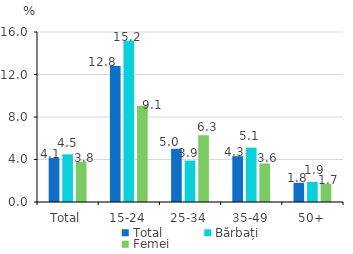
| Category | Total | Bărbați | Femei |
|---|---|---|---|
| Total | 4.138 | 4.486 | 3.781 |
| 15-24 | 12.789 | 15.17 | 9.057 |
| 25-34 | 5.007 | 3.903 | 6.286 |
| 35-49 | 4.31 | 5.118 | 3.627 |
| 50+ | 1.807 | 1.889 | 1.716 |